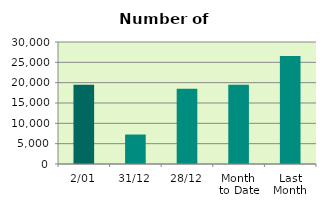
| Category | Series 0 |
|---|---|
| 2/01 | 19474 |
| 31/12 | 7248 |
| 28/12 | 18522 |
| Month 
to Date | 19474 |
| Last
Month | 26558.947 |